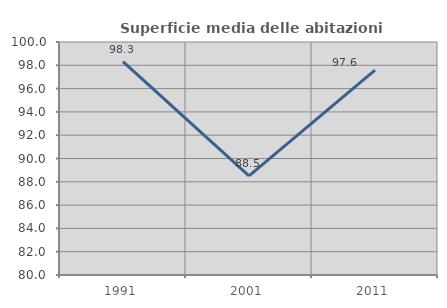
| Category | Superficie media delle abitazioni occupate |
|---|---|
| 1991.0 | 98.318 |
| 2001.0 | 88.509 |
| 2011.0 | 97.589 |